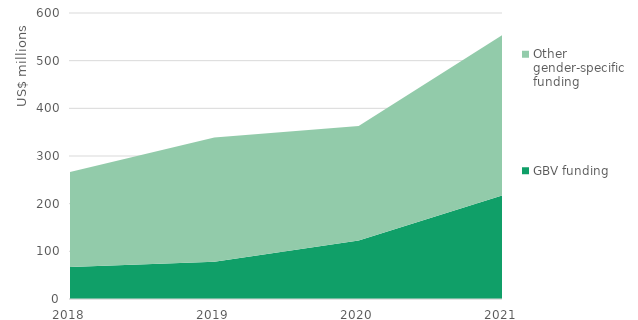
| Category | GBV funding | Other gender-specific funding  |
|---|---|---|
| 2018.0 | 67.26 | 199.14 |
| 2019.0 | 78.358 | 260.687 |
| 2020.0 | 122.843 | 239.965 |
| 2021.0 | 217.694 | 337.108 |